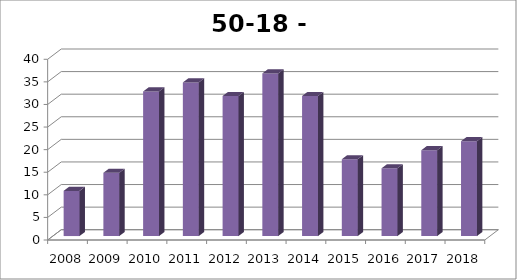
| Category | Berkel-Enschot |
|---|---|
| 2008.0 | 10 |
| 2009.0 | 14 |
| 2010.0 | 32 |
| 2011.0 | 34 |
| 2012.0 | 31 |
| 2013.0 | 36 |
| 2014.0 | 31 |
| 2015.0 | 17 |
| 2016.0 | 15 |
| 2017.0 | 19 |
| 2018.0 | 21 |